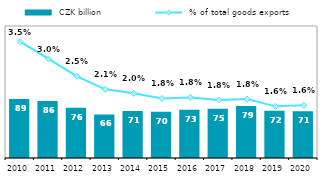
| Category |  CZK billion |
|---|---|
| 2010.0 | 89.274 |
| 2011.0 | 86.46 |
| 2012.0 | 76.073 |
| 2013.0 | 66.078 |
| 2014.0 | 71.144 |
| 2015.0 | 70.087 |
| 2016.0 | 72.922 |
| 2017.0 | 74.65 |
| 2018.0 | 78.676 |
| 2019.0 | 71.661 |
| 2020.0 | 70.864 |